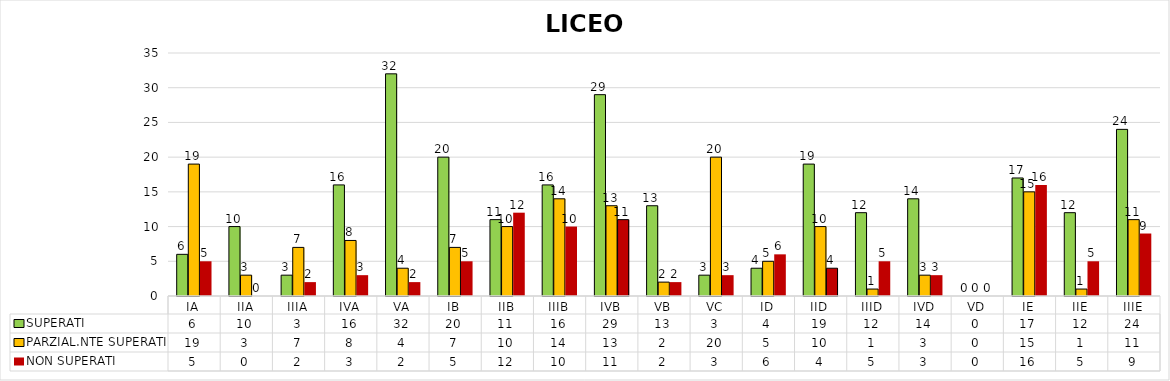
| Category | SUPERATI | PARZIAL.NTE SUPERATI | NON SUPERATI |
|---|---|---|---|
| IA | 6 | 19 | 5 |
| IIA | 10 | 3 | 0 |
| IIIA | 3 | 7 | 2 |
| IVA | 16 | 8 | 3 |
| VA | 32 | 4 | 2 |
| IB | 20 | 7 | 5 |
| IIB | 11 | 10 | 12 |
| IIIB | 16 | 14 | 10 |
| IVB | 29 | 13 | 11 |
| VB | 13 | 2 | 2 |
| VC | 3 | 20 | 3 |
| ID | 4 | 5 | 6 |
| IID | 19 | 10 | 4 |
| IIID | 12 | 1 | 5 |
| IVD | 14 | 3 | 3 |
| VD | 0 | 0 | 0 |
| IE | 17 | 15 | 16 |
| IIE | 12 | 1 | 5 |
| IIIE | 24 | 11 | 9 |